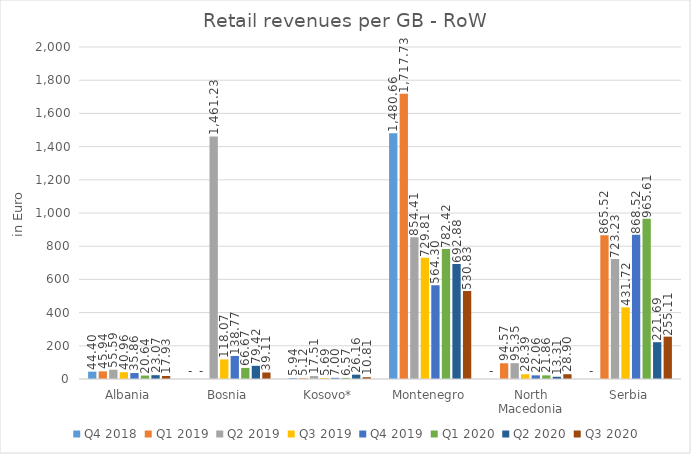
| Category | Q4 2018 | Q1 2019 | Q2 2019 | Q3 2019 | Q4 2019 | Q1 2020 | Q2 2020 | Q3 2020 |
|---|---|---|---|---|---|---|---|---|
| Albania | 44.401 | 45.94 | 55.586 | 40.956 | 35.856 | 20.644 | 23.068 | 17.931 |
| Bosnia | 0 | 0 | 1461.226 | 118.074 | 138.765 | 66.671 | 79.42 | 39.109 |
| Kosovo* | 5.944 | 5.12 | 17.512 | 5.691 | 7.002 | 6.567 | 26.159 | 10.805 |
| Montenegro | 1480.656 | 1717.732 | 854.41 | 729.807 | 564.302 | 782.418 | 692.88 | 530.834 |
| North Macedonia | 0 | 94.568 | 95.354 | 28.393 | 22.059 | 21.858 | 13.308 | 28.903 |
| Serbia | 0 | 865.521 | 723.225 | 431.717 | 868.524 | 965.606 | 221.692 | 255.111 |